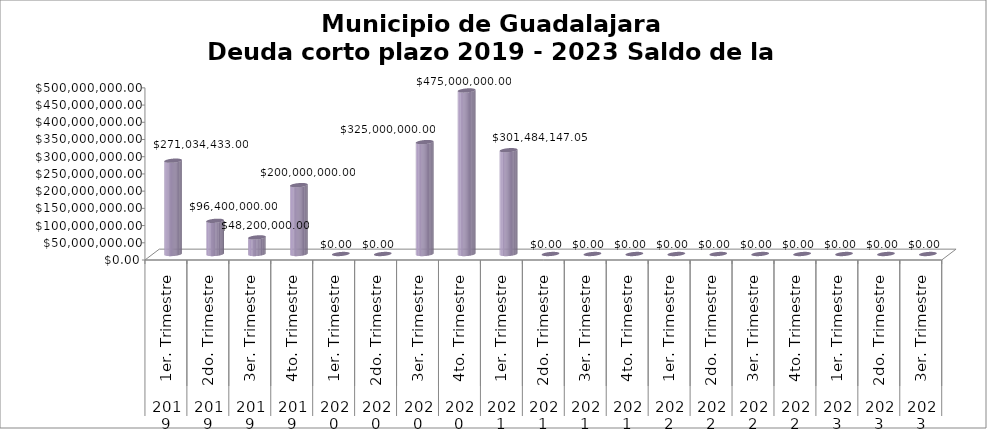
| Category | Municipio de Guadalajara
Deuda corto plazo 2019 - 2023 Saldo de la Deuda |
|---|---|
| 0 | 271034433 |
| 1 | 96400000 |
| 2 | 48200000 |
| 3 | 200000000 |
| 4 | 0 |
| 5 | 0 |
| 6 | 325000000 |
| 7 | 475000000 |
| 8 | 301484147.05 |
| 9 | 0 |
| 10 | 0 |
| 11 | 0 |
| 12 | 0 |
| 13 | 0 |
| 14 | 0 |
| 15 | 0 |
| 16 | 0 |
| 17 | 0 |
| 18 | 0 |